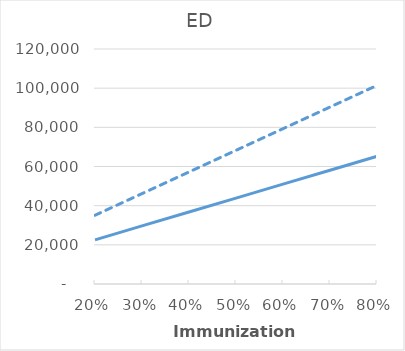
| Category | Low Efficacy, Low RSV Rates | High Efficacy, High RSV Rates |
|---|---|---|
| 0.2 | 22562.856 | 35104.3 |
| 0.30000000000000004 | 29666.029 | 46155.734 |
| 0.4 | 36769.202 | 57207.168 |
| 0.5 | 43872.375 | 68258.601 |
| 0.6 | 50975.548 | 79310.035 |
| 0.7 | 58078.721 | 90361.469 |
| 0.7999999999999999 | 65181.893 | 101412.903 |